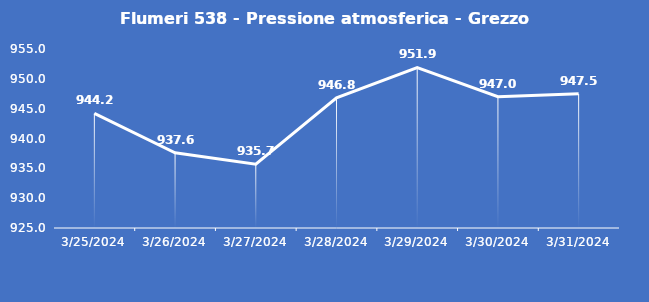
| Category | Flumeri 538 - Pressione atmosferica - Grezzo (hPa) |
|---|---|
| 3/25/24 | 944.2 |
| 3/26/24 | 937.6 |
| 3/27/24 | 935.7 |
| 3/28/24 | 946.8 |
| 3/29/24 | 951.9 |
| 3/30/24 | 947 |
| 3/31/24 | 947.5 |